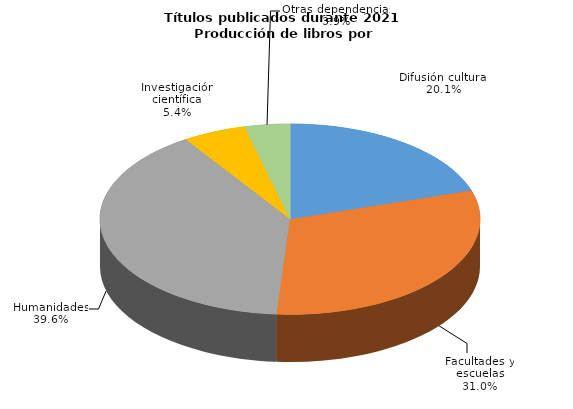
| Category | Series 0 |
|---|---|
| Difusión cultural | 329 |
| Facultades y escuelas | 506 |
| Humanidades | 647 |
| Investigación científica | 88 |
| Otras dependencias | 63 |